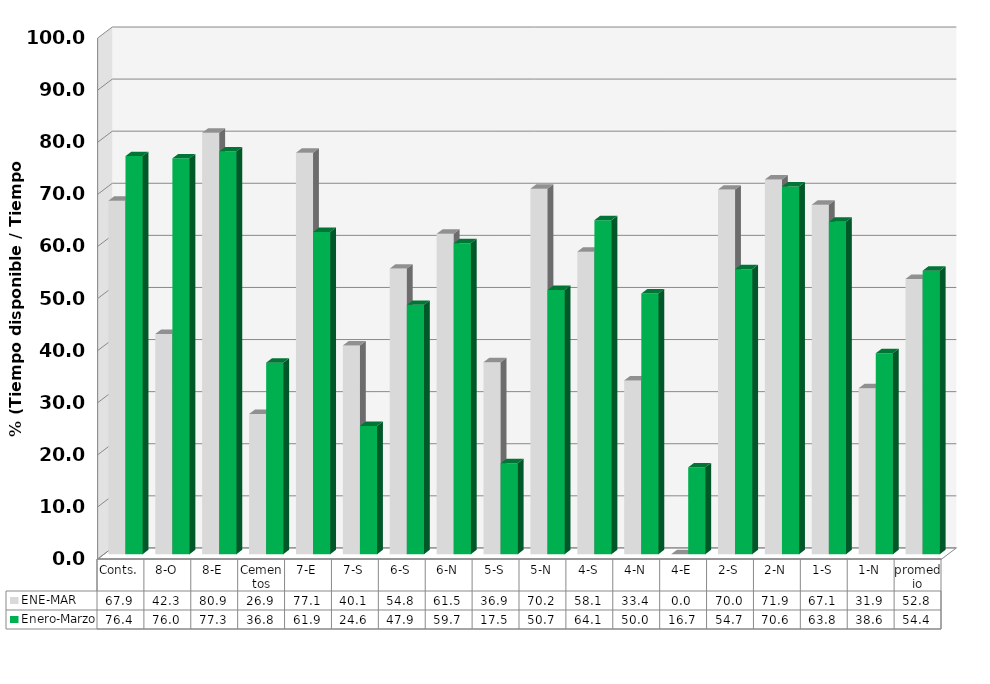
| Category | ENE-MAR | Enero-Marzo |
|---|---|---|
| Conts. | 67.862 | 76.422 |
| 8-O | 42.283 | 75.991 |
| 8-E | 80.901 | 77.335 |
| Cementos | 26.919 | 36.774 |
| 7-E | 77.062 | 61.852 |
| 7-S | 40.077 | 24.634 |
| 6-S | 54.834 | 47.866 |
| 6-N | 61.508 | 59.698 |
| 5-S | 36.865 | 17.465 |
| 5-N | 70.164 | 50.71 |
| 4-S | 58.083 | 64.132 |
| 4-N | 33.357 | 50.041 |
| 4-E | 0 | 16.681 |
| 2-S | 70 | 54.72 |
| 2-N | 71.934 | 70.603 |
| 1-S | 67.092 | 63.814 |
| 1-N | 31.867 | 38.586 |
| promedio | 52.85 | 54.429 |